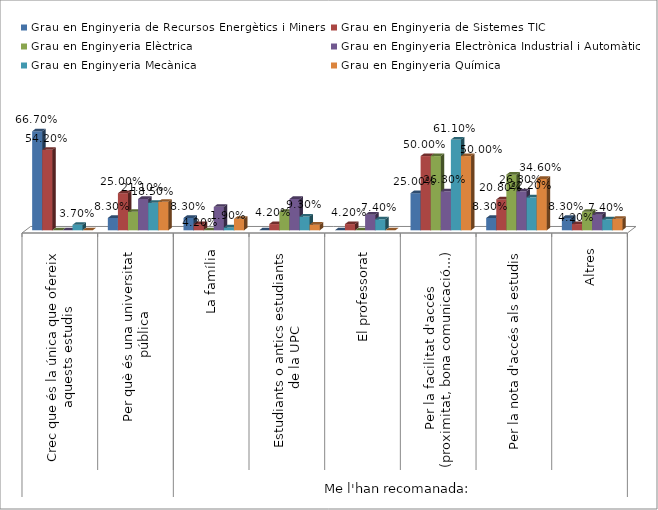
| Category | Grau en Enginyeria de Recursos Energètics i Miners | Grau en Enginyeria de Sistemes TIC | Grau en Enginyeria Elèctrica | Grau en Enginyeria Electrònica Industrial i Automàtica | Grau en Enginyeria Mecànica | Grau en Enginyeria Química |
|---|---|---|---|---|---|---|
| 0 | 0.667 | 0.542 | 0 | 0 | 0.037 | 0 |
| 1 | 0.083 | 0.25 | 0.125 | 0.211 | 0.185 | 0.192 |
| 2 | 0.083 | 0.042 | 0 | 0.158 | 0.019 | 0.077 |
| 3 | 0 | 0.042 | 0.125 | 0.211 | 0.093 | 0.038 |
| 4 | 0 | 0.042 | 0 | 0.105 | 0.074 | 0 |
| 5 | 0.25 | 0.5 | 0.5 | 0.263 | 0.611 | 0.5 |
| 6 | 0.083 | 0.208 | 0.375 | 0.263 | 0.222 | 0.346 |
| 7 | 0.083 | 0.042 | 0.125 | 0.105 | 0.074 | 0.077 |